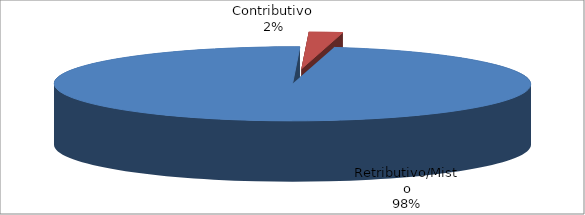
| Category | Decorrenti gennaio - settembreo 2019 |
|---|---|
| Retributivo/Misto | 62765 |
| Contributivo | 1467 |